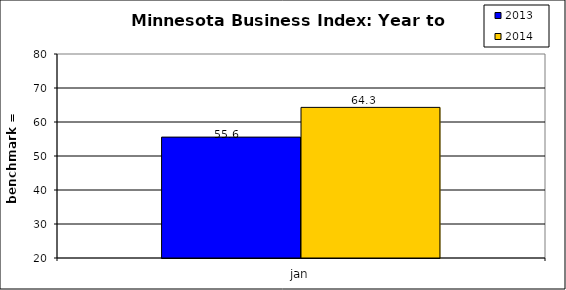
| Category | 2013 | 2014 |
|---|---|---|
| 0 | 55.558 | 64.3 |